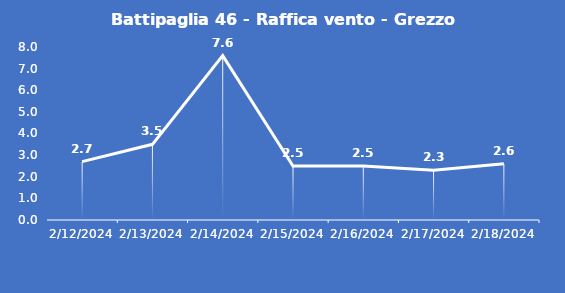
| Category | Battipaglia 46 - Raffica vento - Grezzo (m/s) |
|---|---|
| 2/12/24 | 2.7 |
| 2/13/24 | 3.5 |
| 2/14/24 | 7.6 |
| 2/15/24 | 2.5 |
| 2/16/24 | 2.5 |
| 2/17/24 | 2.3 |
| 2/18/24 | 2.6 |